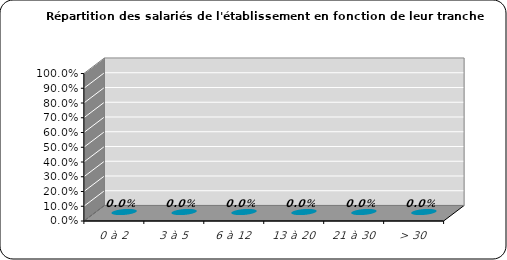
| Category | % |
|---|---|
| 0 à 2 | 0 |
| 3 à 5 | 0 |
| 6 à 12 | 0 |
| 13 à 20 | 0 |
| 21 à 30 | 0 |
| > 30 | 0 |